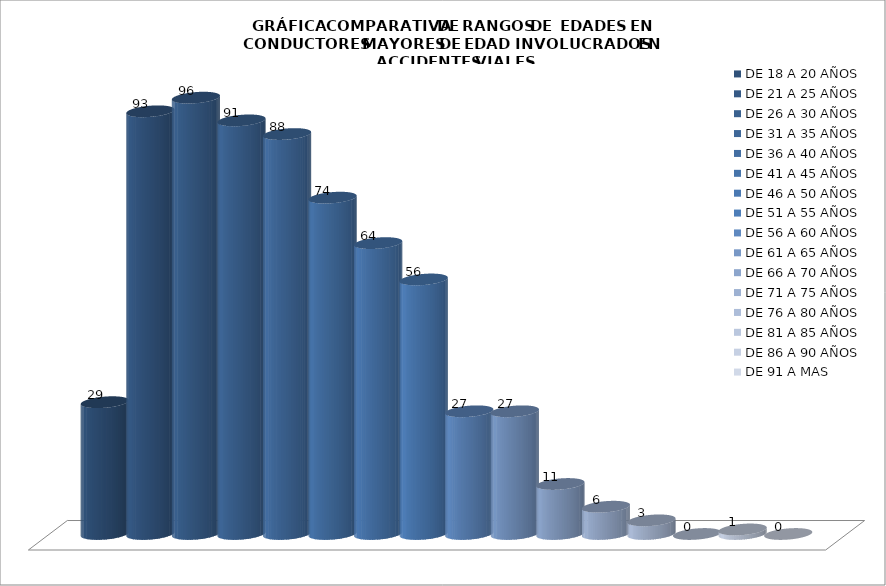
| Category | DE 18 A 20 AÑOS | DE 21 A 25 AÑOS | DE 26 A 30 AÑOS | DE 31 A 35 AÑOS | DE 36 A 40 AÑOS | DE 41 A 45 AÑOS | DE 46 A 50 AÑOS | DE 51 A 55 AÑOS | DE 56 A 60 AÑOS | DE 61 A 65 AÑOS | DE 66 A 70 AÑOS | DE 71 A 75 AÑOS | DE 76 A 80 AÑOS | DE 81 A 85 AÑOS | DE 86 A 90 AÑOS | DE 91 A MAS |
|---|---|---|---|---|---|---|---|---|---|---|---|---|---|---|---|---|
| 0 | 29 | 93 | 96 | 91 | 88 | 74 | 64 | 56 | 27 | 27 | 11 | 6 | 3 | 0 | 1 | 0 |